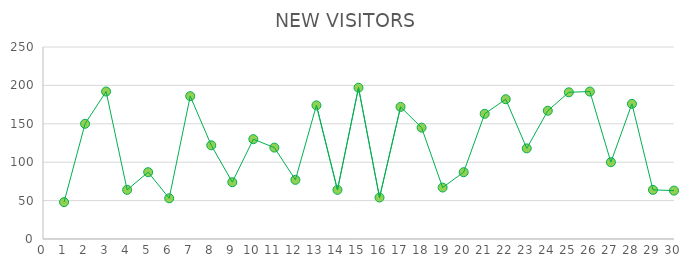
| Category | NEW VISITORS |
|---|---|
| 1.0 | 48 |
| 2.0 | 150 |
| 3.0 | 192 |
| 4.0 | 64 |
| 5.0 | 87 |
| 6.0 | 53 |
| 7.0 | 186 |
| 8.0 | 122 |
| 9.0 | 74 |
| 10.0 | 130 |
| 11.0 | 119 |
| 12.0 | 77 |
| 13.0 | 174 |
| 14.0 | 64 |
| 15.0 | 197 |
| 16.0 | 54 |
| 17.0 | 172 |
| 18.0 | 145 |
| 19.0 | 67 |
| 20.0 | 87 |
| 21.0 | 163 |
| 22.0 | 182 |
| 23.0 | 118 |
| 24.0 | 167 |
| 25.0 | 191 |
| 26.0 | 192 |
| 27.0 | 100 |
| 28.0 | 176 |
| 29.0 | 64 |
| 30.0 | 63 |